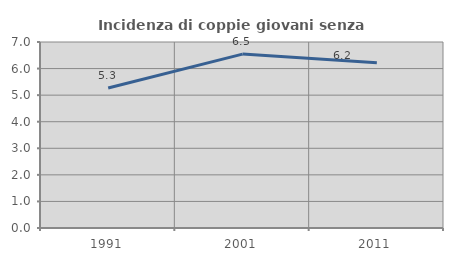
| Category | Incidenza di coppie giovani senza figli |
|---|---|
| 1991.0 | 5.27 |
| 2001.0 | 6.544 |
| 2011.0 | 6.217 |